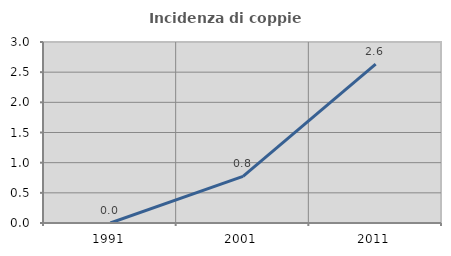
| Category | Incidenza di coppie miste |
|---|---|
| 1991.0 | 0 |
| 2001.0 | 0.772 |
| 2011.0 | 2.632 |